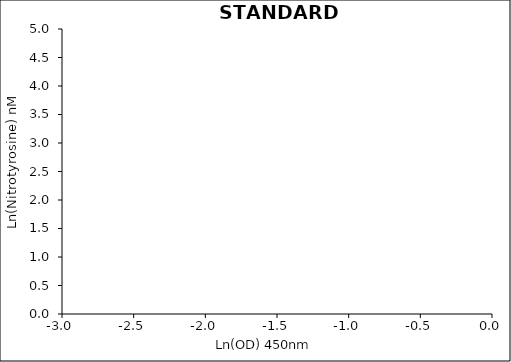
| Category | Ln(Abs) vs Ln(Conc) |
|---|---|
| 0.0 | 8.987 |
| 0.0 | 8.294 |
| 0.0 | 7.601 |
| 0.0 | 6.908 |
| 0.0 | 6.215 |
| 0.0 | 5.521 |
| 0.0 | 4.135 |